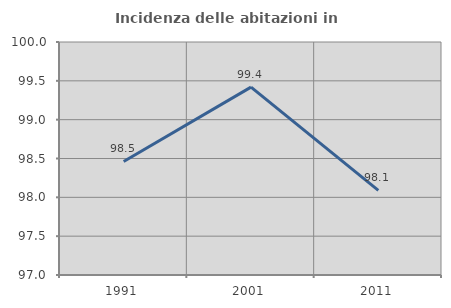
| Category | Incidenza delle abitazioni in proprietà  |
|---|---|
| 1991.0 | 98.462 |
| 2001.0 | 99.419 |
| 2011.0 | 98.089 |